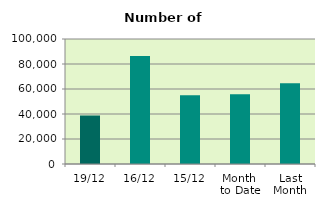
| Category | Series 0 |
|---|---|
| 19/12 | 38800 |
| 16/12 | 86324 |
| 15/12 | 55042 |
| Month 
to Date | 55819.692 |
| Last
Month | 64659.273 |